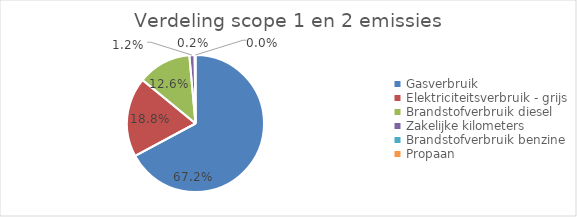
| Category | categorie |
|---|---|
| Gasverbruik | 2282.184 |
| Elektriciteitsverbruik - grijs | 638.071 |
| Brandstofverbruik diesel | 429.579 |
| Zakelijke kilometers | 41.997 |
| Brandstofverbruik benzine | 5.867 |
| Propaan | 1.044 |